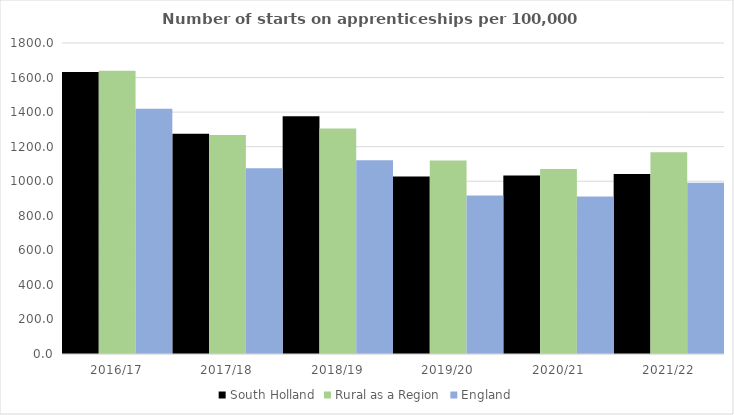
| Category | South Holland | Rural as a Region | England |
|---|---|---|---|
| 2016/17 | 1632 | 1638.789 | 1420 |
| 2017/18 | 1275 | 1267.474 | 1075 |
| 2018/19 | 1376 | 1304.57 | 1122 |
| 2019/20 | 1028 | 1119.662 | 918 |
| 2020/21 | 1033 | 1070.748 | 912 |
| 2021/22 | 1042 | 1167.68 | 991 |